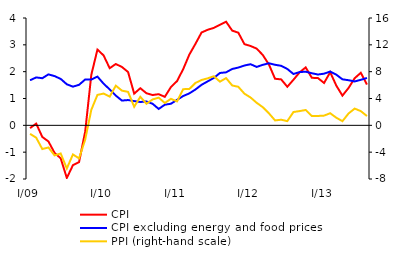
| Category | CPI | CPI excluding energy and food prices |
|---|---|---|
| I/09 | -0.105 | 1.68 |
| 2 | 0.064 | 1.786 |
| 3 | -0.433 | 1.756 |
| 4 | -0.601 | 1.899 |
| 5 | -1.027 | 1.835 |
| 6 | -1.229 | 1.73 |
| 7 | -1.962 | 1.53 |
| 8 | -1.485 | 1.441 |
| 9 | -1.369 | 1.51 |
| 10 | -0.236 | 1.709 |
| 11 | 1.882 | 1.705 |
| 12 | 2.823 | 1.816 |
| I/10 | 2.607 | 1.554 |
| 2 | 2.13 | 1.34 |
| 3 | 2.285 | 1.107 |
| 4 | 2.174 | 0.923 |
| 5 | 1.987 | 0.942 |
| 6 | 1.182 | 0.904 |
| 7 | 1.383 | 0.87 |
| 8 | 1.197 | 0.89 |
| 9 | 1.13 | 0.804 |
| 10 | 1.161 | 0.611 |
| 11 | 1.062 | 0.768 |
| 12 | 1.428 | 0.804 |
| I/11 | 1.65 | 0.95 |
| 2 | 2.094 | 1.092 |
| 3 | 2.634 | 1.19 |
| 4 | 3.037 | 1.335 |
| 5 | 3.46 | 1.51 |
| 6 | 3.562 | 1.639 |
| 7 | 3.631 | 1.765 |
| 8 | 3.746 | 1.951 |
| 9 | 3.863 | 1.975 |
| 10 | 3.531 | 2.1 |
| 11 | 3.453 | 2.153 |
| 12 | 3.025 | 2.23 |
| I/12 | 2.957 | 2.277 |
| 2 | 2.859 | 2.177 |
| 3 | 2.619 | 2.255 |
| 4 | 2.266 | 2.314 |
| 5 | 1.736 | 2.257 |
| 6 | 1.712 | 2.218 |
| 7 | 1.437 | 2.1 |
| 8 | 1.697 | 1.913 |
| 9 | 1.973 | 1.985 |
| 10 | 2.159 | 1.999 |
| 11 | 1.771 | 1.941 |
| 12 | 1.761 | 1.893 |
| I/13 | 1.579 | 1.925 |
| 2 | 1.979 | 2.004 |
| 3 | 1.481 | 1.887 |
| 4 | 1.107 | 1.715 |
| 5 | 1.392 | 1.681 |
| 6 | 1.756 | 1.636 |
| 7 | 1.959 | 1.696 |
| 8 | 1.522 | 1.765 |